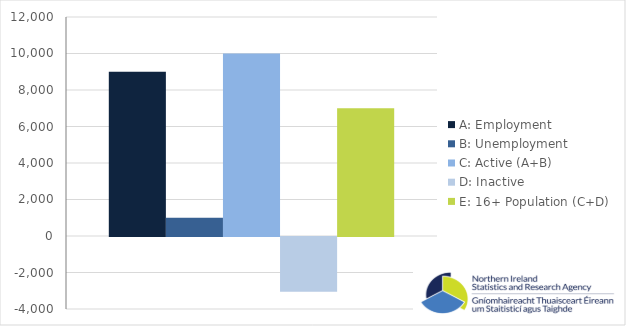
| Category | A: Employment | B: Unemployment | C: Active (A+B) | D: Inactive | E: 16+ Population (C+D) |
|---|---|---|---|---|---|
| 0 | 9000 | 1000 | 10000 | -3000 | 7000 |